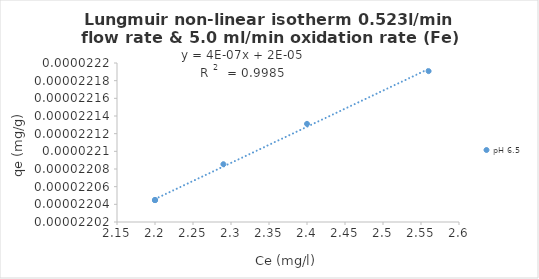
| Category | pH 6.5 |
|---|---|
| 2.2 | 0 |
| 2.2 | 0 |
| 2.29 | 0 |
| 2.2 | 0 |
| 2.4 | 0 |
| 2.56 | 0 |